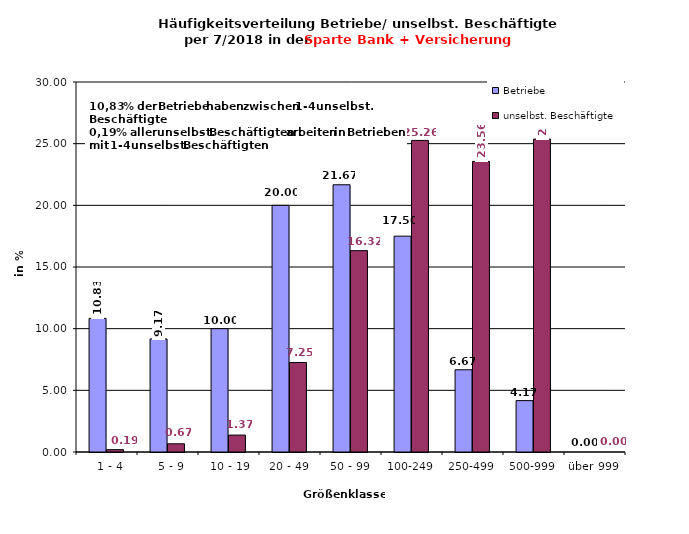
| Category | Betriebe | unselbst. Beschäftigte |
|---|---|---|
|   1 - 4 | 10.833 | 0.189 |
|   5 - 9 | 9.167 | 0.665 |
|  10 - 19 | 10 | 1.372 |
| 20 - 49 | 20 | 7.254 |
| 50 - 99 | 21.667 | 16.324 |
| 100-249 | 17.5 | 25.263 |
| 250-499 | 6.667 | 23.562 |
| 500-999 | 4.167 | 25.37 |
| über 999 | 0 | 0 |